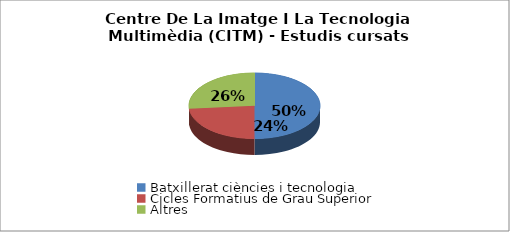
| Category | Centre De La Imatge I La Tecnologia Multimèdia (CITM) - Estudis cursats |
|---|---|
| Batxillerat ciències i tecnologia | 0.5 |
| Cicles Formatius de Grau Superior | 0.235 |
| Altres | 0.265 |